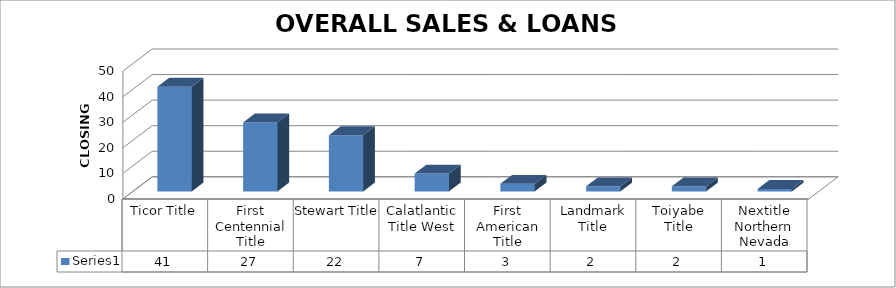
| Category | Series 0 |
|---|---|
| Ticor Title | 41 |
| First Centennial Title | 27 |
| Stewart Title | 22 |
| Calatlantic Title West | 7 |
| First American Title | 3 |
| Landmark Title | 2 |
| Toiyabe Title | 2 |
| Nextitle Northern Nevada | 1 |